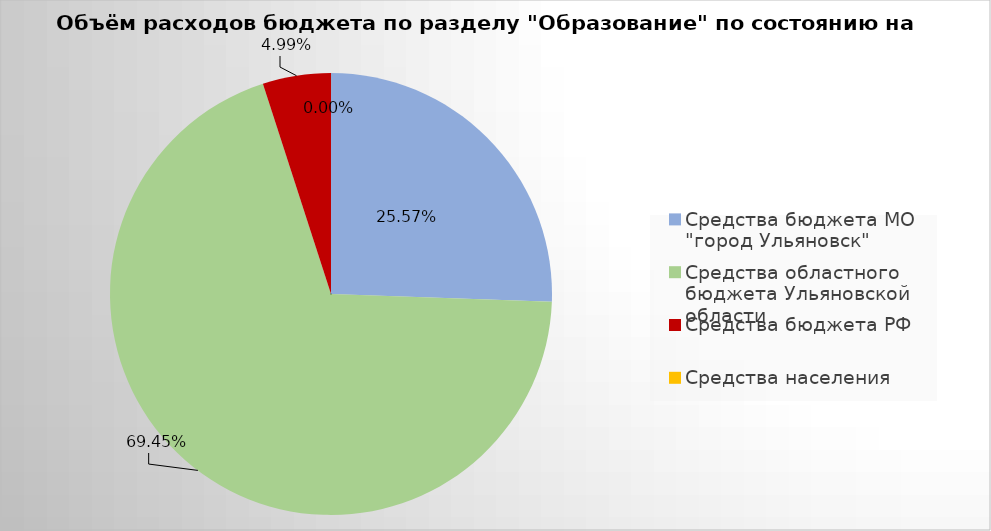
| Category | Series 0 |
|---|---|
| Средства бюджета МО "город Ульяновск" | 2560667.59 |
| Средства областного бюджета Ульяновской области | 6956181.99 |
| Средства бюджета РФ | 499436.26 |
| Средства населения | 0 |